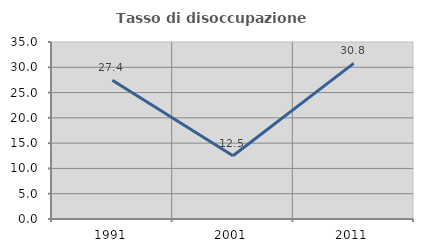
| Category | Tasso di disoccupazione giovanile  |
|---|---|
| 1991.0 | 27.419 |
| 2001.0 | 12.5 |
| 2011.0 | 30.769 |